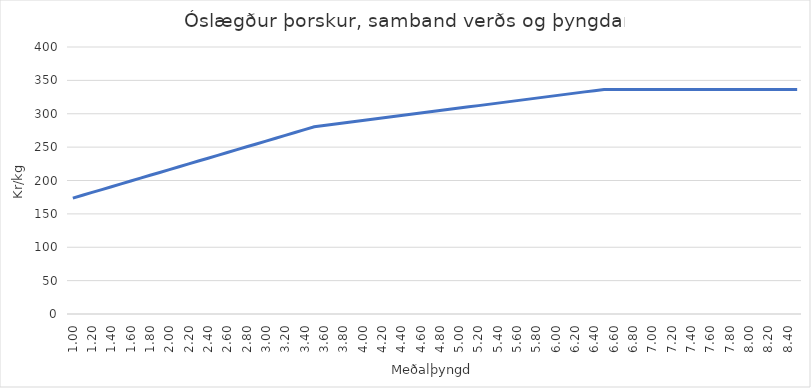
| Category | Series 0 |
|---|---|
| 1.0 | 173.587 |
| 1.1 | 177.86 |
| 1.2 | 182.133 |
| 1.3 | 186.406 |
| 1.4 | 190.679 |
| 1.5 | 194.952 |
| 1.6 | 199.225 |
| 1.7 | 203.498 |
| 1.8 | 207.77 |
| 1.9 | 212.043 |
| 2.0 | 216.316 |
| 2.1 | 220.589 |
| 2.2 | 224.862 |
| 2.3 | 229.135 |
| 2.4 | 233.408 |
| 2.5 | 237.681 |
| 2.6 | 241.954 |
| 2.7 | 246.227 |
| 2.8 | 250.5 |
| 2.9 | 254.773 |
| 3.0 | 259.045 |
| 3.1 | 263.318 |
| 3.2 | 267.591 |
| 3.3 | 271.864 |
| 3.4 | 276.137 |
| 3.5 | 280.41 |
| 3.6 | 282.279 |
| 3.7 | 284.149 |
| 3.8 | 286.018 |
| 3.9 | 287.888 |
| 4.0 | 289.757 |
| 4.1 | 291.626 |
| 4.2 | 293.496 |
| 4.3 | 295.365 |
| 4.4 | 297.235 |
| 4.5 | 299.104 |
| 4.6 | 300.973 |
| 4.7 | 302.843 |
| 4.8 | 304.712 |
| 4.9 | 306.582 |
| 5.0 | 308.451 |
| 5.1 | 310.32 |
| 5.2 | 312.19 |
| 5.3 | 314.059 |
| 5.4 | 315.929 |
| 5.5 | 317.798 |
| 5.6 | 319.667 |
| 5.7 | 321.537 |
| 5.8 | 323.406 |
| 5.9 | 325.276 |
| 6.0 | 327.145 |
| 6.1 | 329.014 |
| 6.2 | 330.884 |
| 6.3 | 332.753 |
| 6.4 | 334.623 |
| 6.50000000000001 | 336.492 |
| 6.6 | 336.492 |
| 6.7 | 336.492 |
| 6.80000000000001 | 336.492 |
| 6.90000000000001 | 336.492 |
| 7.00000000000001 | 336.492 |
| 7.100000000000009 | 336.492 |
| 7.200000000000009 | 336.492 |
| 7.300000000000009 | 336.492 |
| 7.400000000000008 | 336.492 |
| 7.500000000000008 | 336.492 |
| 7.600000000000008 | 336.492 |
| 7.700000000000007 | 336.492 |
| 7.800000000000007 | 336.492 |
| 7.900000000000007 | 336.492 |
| 8.000000000000007 | 336.492 |
| 8.100000000000007 | 336.492 |
| 8.200000000000006 | 336.492 |
| 8.300000000000006 | 336.492 |
| 8.400000000000006 | 336.492 |
| 8.500000000000005 | 336.492 |